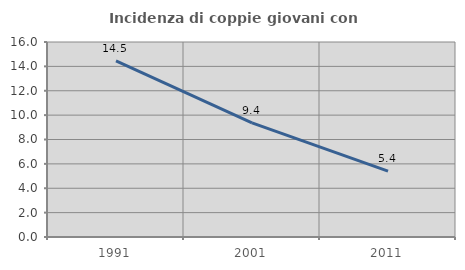
| Category | Incidenza di coppie giovani con figli |
|---|---|
| 1991.0 | 14.452 |
| 2001.0 | 9.358 |
| 2011.0 | 5.41 |